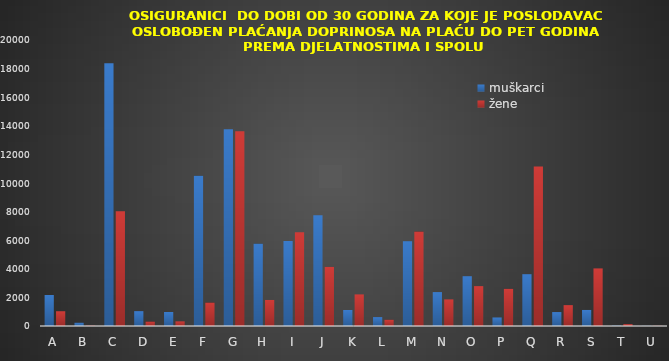
| Category | muškarci | žene |
|---|---|---|
| A | 2169 | 1033 |
| B | 232 | 29 |
| C | 18376 | 8030 |
| D | 1039 | 311 |
| E | 981 | 324 |
| F | 10513 | 1641 |
| G | 13757 | 13621 |
| H | 5760 | 1822 |
| I | 5943 | 6555 |
| J | 7739 | 4135 |
| K | 1121 | 2210 |
| L | 622 | 440 |
| M | 5930 | 6604 |
| N | 2371 | 1861 |
| O | 3482 | 2788 |
| P | 597 | 2600 |
| Q | 3623 | 11159 |
| R | 975 | 1459 |
| S | 1122 | 4027 |
| T | 28 | 131 |
| U | 11 | 14 |